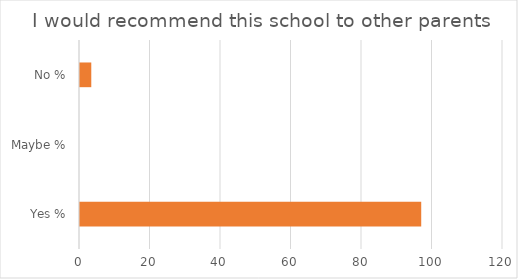
| Category | Series 0 |
|---|---|
| Yes % | 96.8 |
| Maybe % | 0 |
| No % | 3.2 |